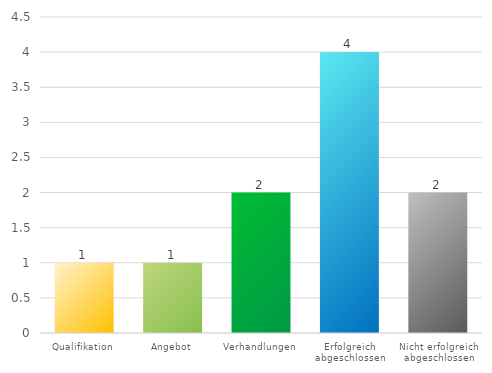
| Category | Series 0 |
|---|---|
| Qualifikation | 1 |
| Angebot | 1 |
| Verhandlungen | 2 |
| Erfolgreich abgeschlossen | 4 |
| Nicht erfolgreich abgeschlossen | 2 |